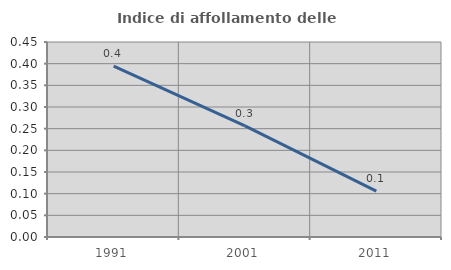
| Category | Indice di affollamento delle abitazioni  |
|---|---|
| 1991.0 | 0.394 |
| 2001.0 | 0.256 |
| 2011.0 | 0.106 |